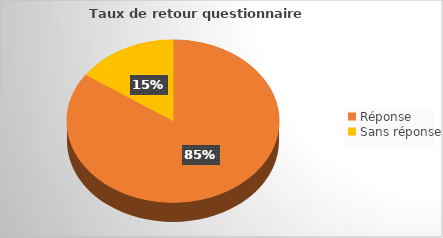
| Category | Series 0 |
|---|---|
| Réponse | 0.846 |
| Sans réponse | 0.154 |